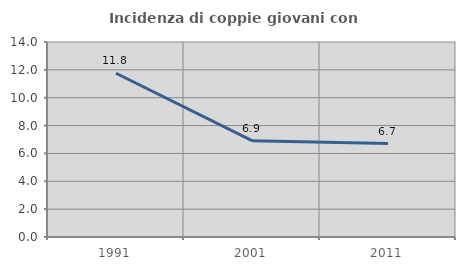
| Category | Incidenza di coppie giovani con figli |
|---|---|
| 1991.0 | 11.757 |
| 2001.0 | 6.914 |
| 2011.0 | 6.705 |